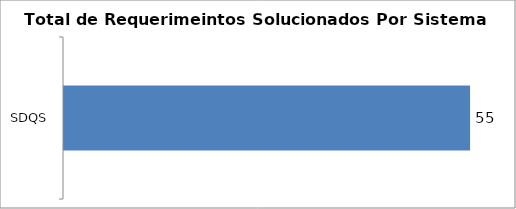
| Category | Total |
|---|---|
| SDQS | 55 |